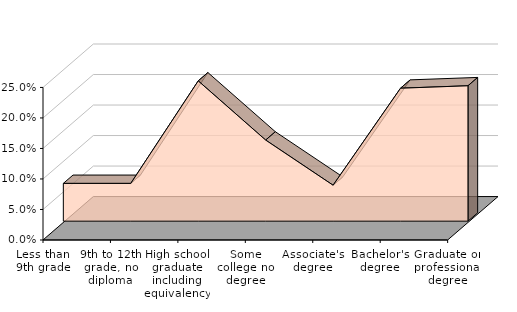
| Category | Westchester |
|---|---|
| Less than 9th grade | 0.064 |
| 9th to 12th grade, no diploma | 0.064 |
| High school graduate including equivalency | 0.232 |
| Some college no degree | 0.135 |
| Associate's degree | 0.061 |
| Bachelor's degree | 0.22 |
| Graduate or professional degree | 0.224 |